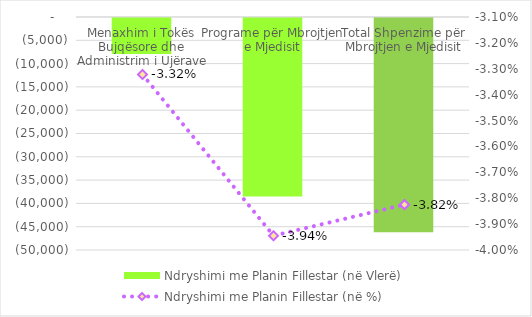
| Category | Ndryshimi me Planin Fillestar (në Vlerë) |
|---|---|
| Menaxhim i Tokës Bujqësore dhe Administrim i Ujërave | -7700 |
| Programe për Mbrojtjen e Mjedisit | -38300 |
| Total Shpenzime për Mbrojtjen e Mjedisit | -46000 |